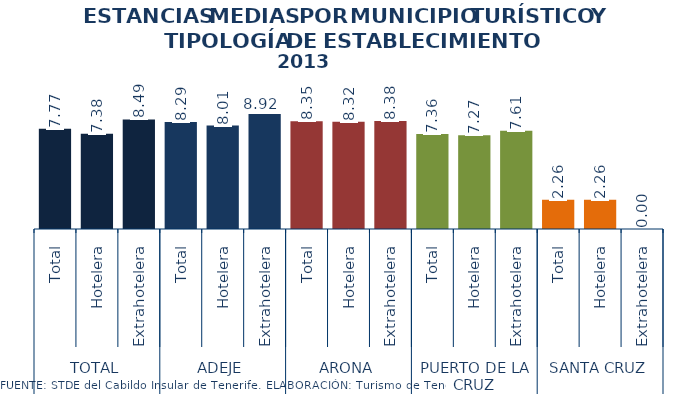
| Category | Series 2 |
|---|---|
| 0 | 7.771 |
| 1 | 7.378 |
| 2 | 8.491 |
| 3 | 8.286 |
| 4 | 8.015 |
| 5 | 8.918 |
| 6 | 8.352 |
| 7 | 8.322 |
| 8 | 8.381 |
| 9 | 7.358 |
| 10 | 7.267 |
| 11 | 7.61 |
| 12 | 2.259 |
| 13 | 2.259 |
| 14 | 0 |